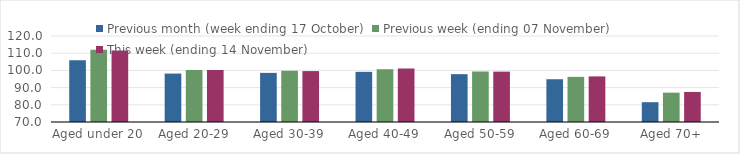
| Category | Previous month (week ending 17 October) | Previous week (ending 07 November) | This week (ending 14 November) |
|---|---|---|---|
| Aged under 20 | 105.96 | 111.98 | 111.55 |
| Aged 20-29 | 98.16 | 100.19 | 100.25 |
| Aged 30-39 | 98.55 | 99.73 | 99.6 |
| Aged 40-49 | 99.16 | 100.69 | 101.08 |
| Aged 50-59 | 97.81 | 99.36 | 99.28 |
| Aged 60-69 | 94.86 | 96.24 | 96.51 |
| Aged 70+ | 81.52 | 87.06 | 87.47 |